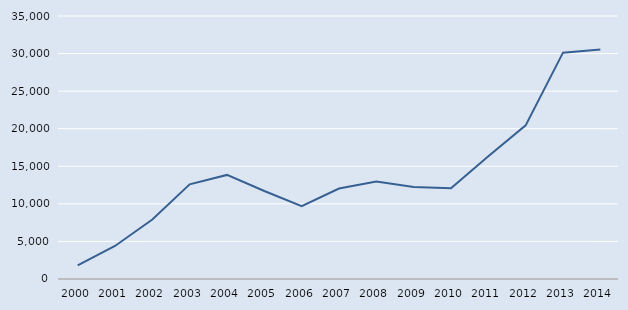
| Category | Series 0 |
|---|---|
| 2000.0 | 1811 |
| 2001.0 | 4396 |
| 2002.0 | 7915 |
| 2003.0 | 12603 |
| 2004.0 | 13850 |
| 2005.0 | 11710 |
| 2006.0 | 9700 |
| 2007.0 | 12040 |
| 2008.0 | 12980 |
| 2009.0 | 12230 |
| 2010.0 | 12080 |
| 2011.0 | 16350 |
| 2012.0 | 20443 |
| 2013.0 | 30121 |
| 2014.0 | 30546 |